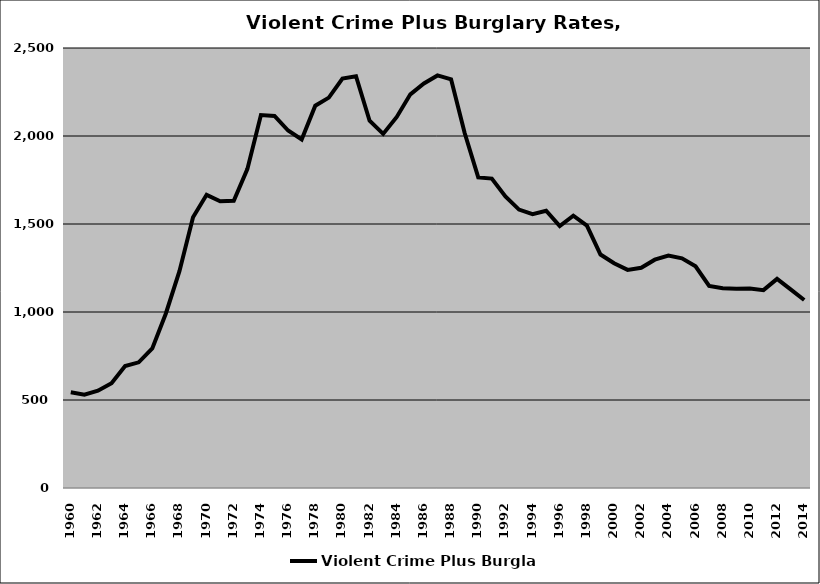
| Category | Violent Crime Plus Burglary |
|---|---|
| 1960.0 | 544.088 |
| 1961.0 | 530.014 |
| 1962.0 | 552.495 |
| 1963.0 | 595.672 |
| 1964.0 | 692.862 |
| 1965.0 | 714.114 |
| 1966.0 | 792.987 |
| 1967.0 | 991.675 |
| 1968.0 | 1232.265 |
| 1969.0 | 1538.771 |
| 1970.0 | 1665.802 |
| 1971.0 | 1629.255 |
| 1972.0 | 1632.007 |
| 1973.0 | 1811.84 |
| 1974.0 | 2118.728 |
| 1975.0 | 2113.883 |
| 1976.0 | 2031.008 |
| 1977.0 | 1980.481 |
| 1978.0 | 2171.913 |
| 1979.0 | 2218.237 |
| 1980.0 | 2326.484 |
| 1981.0 | 2339.387 |
| 1982.0 | 2086.525 |
| 1983.0 | 2011.907 |
| 1984.0 | 2108.462 |
| 1985.0 | 2236.698 |
| 1986.0 | 2298.521 |
| 1987.0 | 2344.05 |
| 1988.0 | 2322.018 |
| 1989.0 | 2016.866 |
| 1990.0 | 1764.443 |
| 1991.0 | 1758.071 |
| 1992.0 | 1656.269 |
| 1993.0 | 1581.789 |
| 1994.0 | 1555.493 |
| 1995.0 | 1575.493 |
| 1996.0 | 1488.686 |
| 1997.0 | 1547.077 |
| 1998.0 | 1491.053 |
| 1999.0 | 1326.671 |
| 2000.0 | 1276.933 |
| 2001.0 | 1239.399 |
| 2002.0 | 1251.216 |
| 2003.0 | 1297.327 |
| 2004.0 | 1320.467 |
| 2005.0 | 1304.662 |
| 2006.0 | 1259.358 |
| 2007.0 | 1148.24 |
| 2008.0 | 1134.544 |
| 2009.0 | 1132.305 |
| 2010.0 | 1134.13 |
| 2011.0 | 1124.285 |
| 2012.0 | 1188.183 |
| 2013.0 | 1128.662 |
| 2014.0 | 1068.125 |